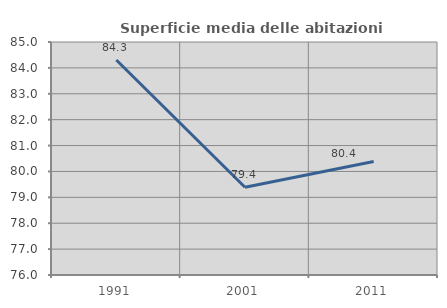
| Category | Superficie media delle abitazioni occupate |
|---|---|
| 1991.0 | 84.306 |
| 2001.0 | 79.388 |
| 2011.0 | 80.381 |